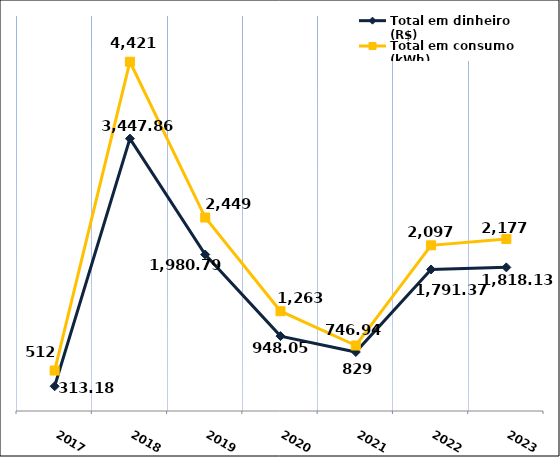
| Category | Total em dinheiro (R$) |
|---|---|
| 2017.0 | 313.18 |
| 2018.0 | 3447.86 |
| 2019.0 | 1980.79 |
| 2020.0 | 948.05 |
| 2021.0 | 746.94 |
| 2022.0 | 1791.37 |
| 2023.0 | 1818.13 |